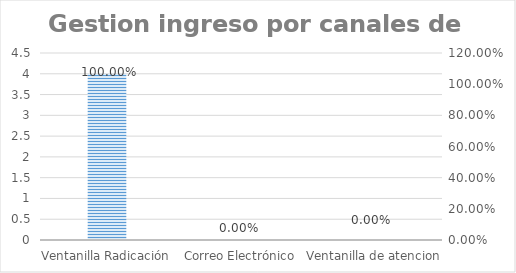
| Category | Series 0 |
|---|---|
| Ventanilla Radicación | 4 |
| Correo Electrónico | 0 |
| Ventanilla de atencion | 0 |